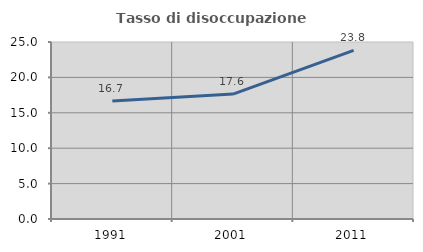
| Category | Tasso di disoccupazione giovanile  |
|---|---|
| 1991.0 | 16.667 |
| 2001.0 | 17.647 |
| 2011.0 | 23.81 |